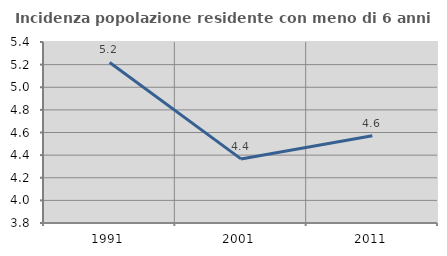
| Category | Incidenza popolazione residente con meno di 6 anni |
|---|---|
| 1991.0 | 5.219 |
| 2001.0 | 4.367 |
| 2011.0 | 4.571 |